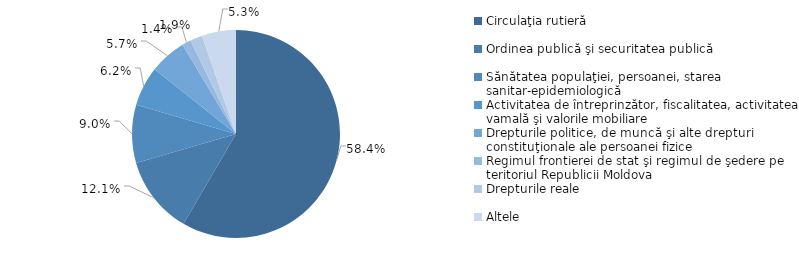
| Category | Series 0 |
|---|---|
| Circulaţia rutieră | 0.584 |
| Ordinea publică şi securitatea publică | 0.121 |
| Sănătatea populaţiei, persoanei, starea sanitar-epidemiologică | 0.09 |
| Activitatea de întreprinzător, fiscalitatea, activitatea vamală şi valorile mobiliare | 0.062 |
| Drepturile politice, de muncă şi alte drepturi constituţionale ale persoanei fizice  | 0.057 |
| Regimul frontierei de stat şi regimul de şedere pe teritoriul Republicii Moldova | 0.014 |
| Drepturile reale | 0.019 |
| Altele | 0.053 |